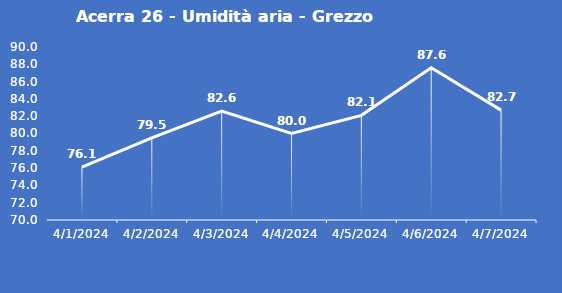
| Category | Acerra 26 - Umidità aria - Grezzo (%) |
|---|---|
| 4/1/24 | 76.1 |
| 4/2/24 | 79.5 |
| 4/3/24 | 82.6 |
| 4/4/24 | 80 |
| 4/5/24 | 82.1 |
| 4/6/24 | 87.6 |
| 4/7/24 | 82.7 |